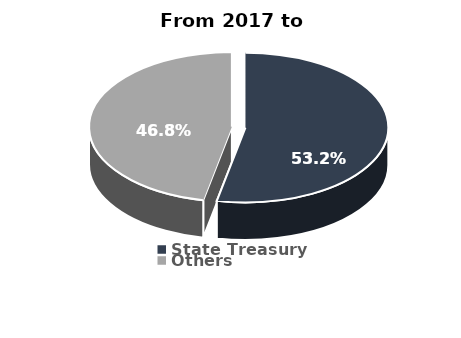
| Category | Series 0 |
|---|---|
| State Treasury | 0.532 |
| Others | 0.468 |